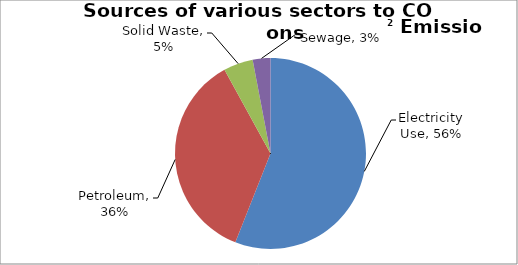
| Category | Contribution (%) |
|---|---|
| Electricity Use | 0.56 |
| Petroleum | 0.36 |
| Solid Waste | 0.05 |
| Sewage | 0.03 |